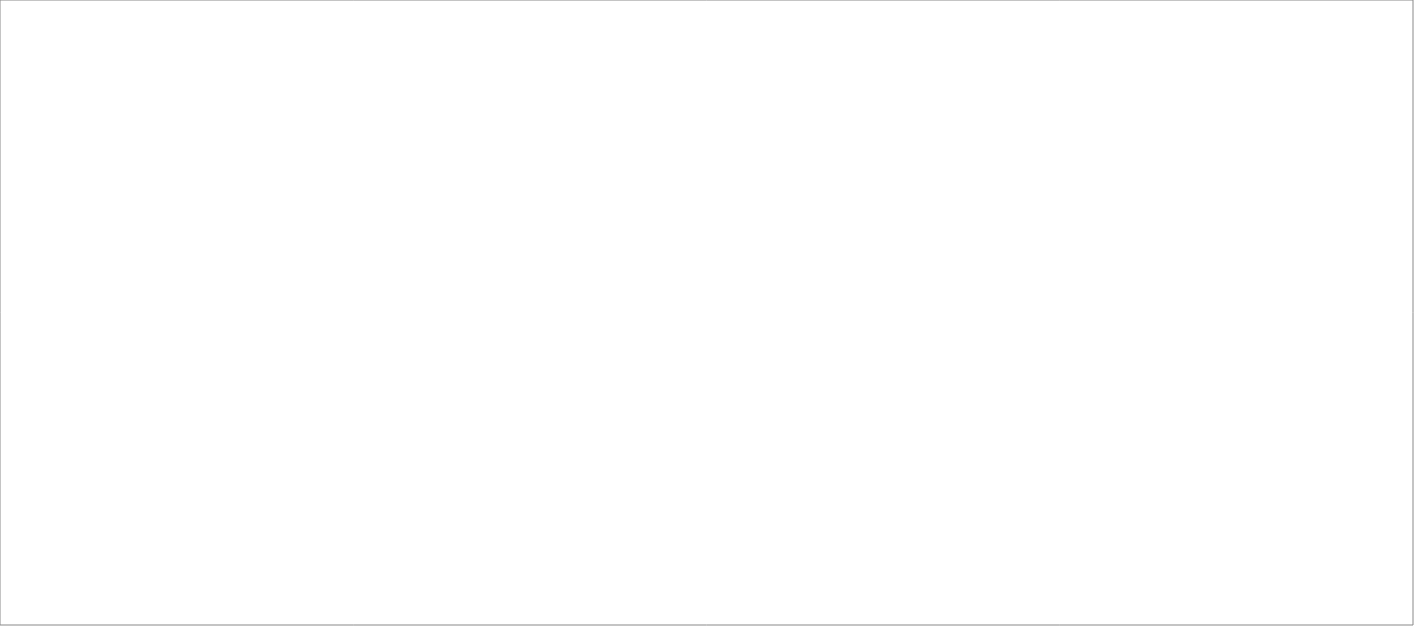
| Category | Total |
|---|---|
| Poolia Sverige AB | 85 |
| Wise Professionals AB | 65 |
| Experis AB | 45 |
| FXL Sweden AB | 25 |
| Source Executive Recruitment Sweden AB | 25 |